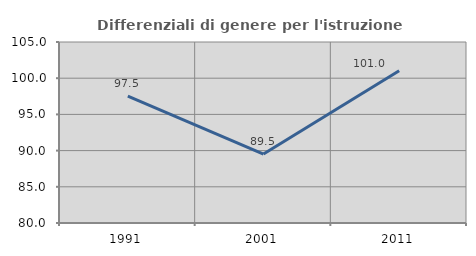
| Category | Differenziali di genere per l'istruzione superiore |
|---|---|
| 1991.0 | 97.531 |
| 2001.0 | 89.519 |
| 2011.0 | 101.021 |